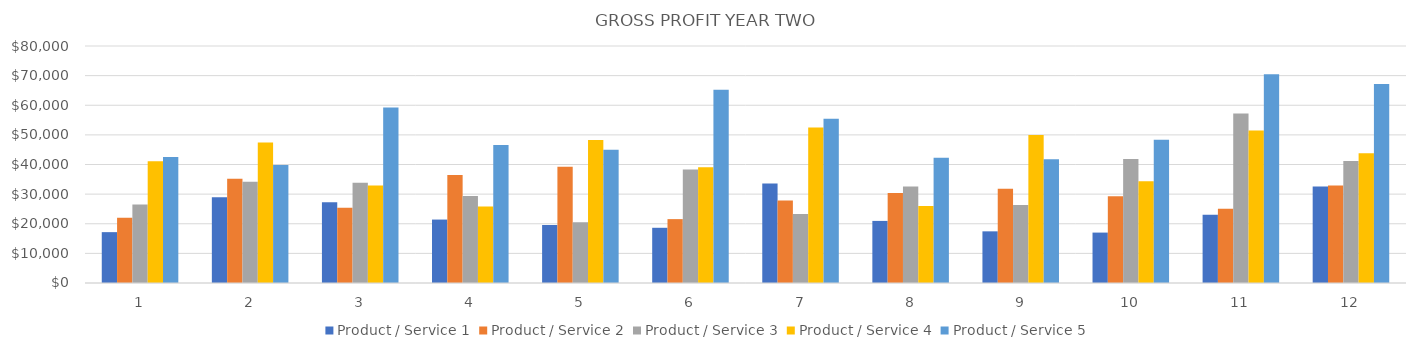
| Category | Product / Service 1 | Product / Service 2 | Product / Service 3 | Product / Service 4 | Product / Service 5 |
|---|---|---|---|---|---|
| 0 | 17167.8 | 21992.6 | 26467 | 41126.4 | 42546 |
| 1 | 28975.1 | 35202.65 | 34178.4 | 47385.9 | 39830 |
| 2 | 27264 | 25397.75 | 33852 | 32945 | 59276 |
| 3 | 21413.6 | 36433.8 | 29356.6 | 25861.5 | 46578 |
| 4 | 19574.7 | 39261.6 | 20536 | 48289.5 | 45010 |
| 5 | 18637.5 | 21563.4 | 38322 | 39049.5 | 65212 |
| 6 | 33575.9 | 27828.85 | 23328 | 52448 | 55468 |
| 7 | 20959.2 | 30360 | 32580 | 26026 | 42238 |
| 8 | 17437.6 | 31848 | 26289 | 49962 | 41748 |
| 9 | 17017 | 29310.05 | 41841 | 34386 | 48356 |
| 10 | 23032.1 | 25074.75 | 57220.9 | 51454 | 70490 |
| 11 | 32578 | 32910 | 41140 | 43836 | 67192 |